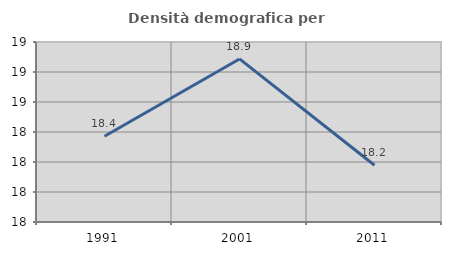
| Category | Densità demografica |
|---|---|
| 1991.0 | 18.371 |
| 2001.0 | 18.887 |
| 2011.0 | 18.178 |